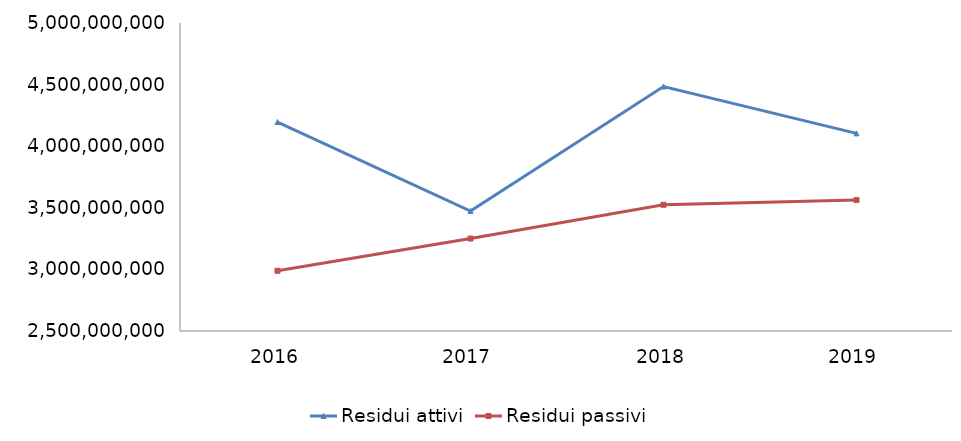
| Category | Residui attivi | Residui passivi |
|---|---|---|
| 2016.0 | 4195895664.22 | 2988738998.77 |
| 2017.0 | 3473829536.82 | 3250553809.18 |
| 2018.0 | 4484244951.27 | 3524549763.77 |
| 2019.0 | 4104231217.5 | 3562994740.15 |